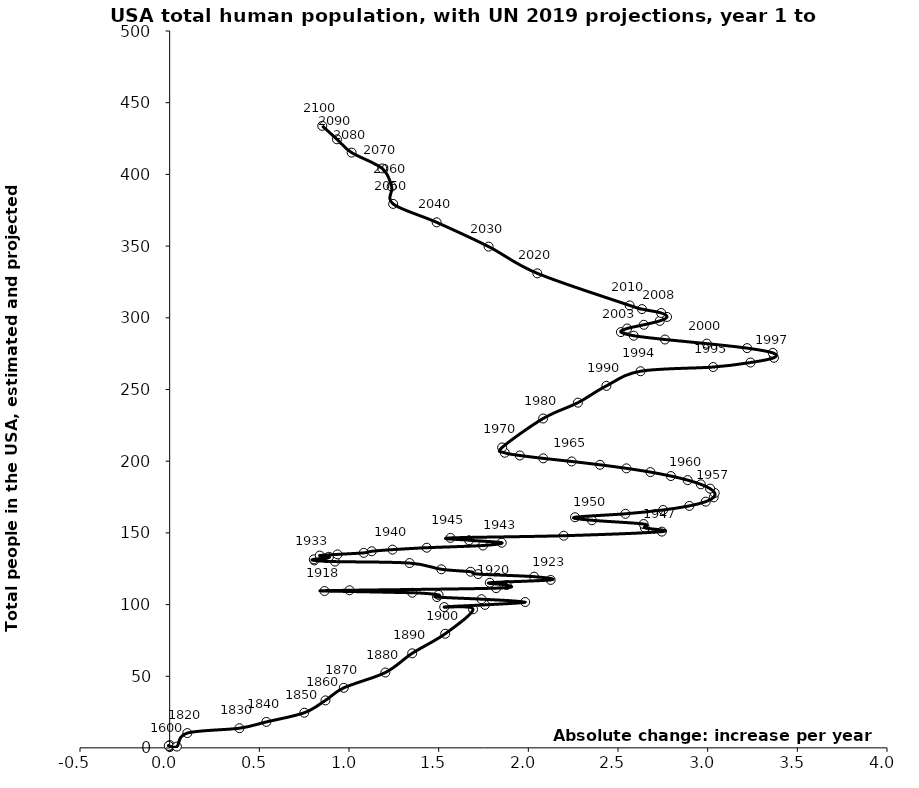
| Category | Series 0 |
|---|---|
| 0.00066 | 0.64 |
| 0.0009072715143428952 | 1.3 |
| 0.00033333333333333327 | 2 |
| -0.005 | 1.5 |
| 0.040494261848412885 | 1 |
| 0.09852621255219518 | 10.409 |
| 0.38917395290568474 | 13.808 |
| 0.5391515117391295 | 18.192 |
| 0.7506387753965683 | 24.591 |
| 0.8687885371431469 | 33.205 |
| 0.9708988578854225 | 41.967 |
| 1.2025425032091952 | 52.623 |
| 1.3522845372838561 | 66.018 |
| 1.536461801221178 | 79.669 |
| 1.6916889325819204 | 96.747 |
| 1.5309865428085487 | 98.277 |
| 1.7583401302283477 | 99.809 |
| 1.9825649985552047 | 101.794 |
| 1.739046362488594 | 103.774 |
| 1.4908346477825773 | 105.272 |
| 1.499699351879208 | 106.756 |
| 1.352649554511359 | 108.271 |
| 0.8635264696495071 | 109.461 |
| 1.0027544692850299 | 109.998 |
| 1.8203930589048483 | 111.467 |
| 1.8787958153062547 | 113.639 |
| 1.7849342425182755 | 115.224 |
| 2.12440026410151 | 117.209 |
| 2.0321030508599804 | 119.473 |
| 1.7202740479309924 | 121.273 |
| 1.6780363401763907 | 122.914 |
| 1.5150822207528059 | 124.629 |
| 1.3377881388199349 | 128.974 |
| 0.9219292260509206 | 129.981 |
| 0.8066880727945573 | 130.818 |
| 0.8040808068837748 | 131.594 |
| 0.8755198928390797 | 132.426 |
| 0.8880347692108188 | 133.345 |
| 0.8369323573595722 | 134.202 |
| 0.9360084619691094 | 135.019 |
| 1.082015352972661 | 136.074 |
| 1.1268603266380381 | 137.183 |
| 1.2426229330765608 | 138.328 |
| 1.4334747977454612 | 139.668 |
| 1.746868160220913 | 141.195 |
| 1.8516802498341889 | 143.162 |
| 1.6696930892619122 | 144.898 |
| 1.565923906012955 | 146.501 |
| 2.1974037096032646 | 148.03 |
| 2.744408097684399 | 150.896 |
| 2.6500250717142677 | 153.519 |
| 2.6427247271640653 | 156.196 |
| 2.354474408570894 | 158.804 |
| 2.260227999999998 | 160.905 |
| 2.5415775000000025 | 163.325 |
| 2.751381000000009 | 165.988 |
| 2.897825999999995 | 168.828 |
| 2.989163999999988 | 171.784 |
| 3.033657000000005 | 174.806 |
| 3.0392585000000025 | 177.851 |
| 3.0133584999999954 | 180.884 |
| 2.9618850000000094 | 183.878 |
| 2.88851600000001 | 186.808 |
| 2.794756499999991 | 189.655 |
| 2.6806529999999924 | 192.398 |
| 2.547051499999995 | 195.016 |
| 2.3996645 | 197.492 |
| 2.241689000000008 | 199.816 |
| 2.083194000000006 | 201.975 |
| 1.9525979999999947 | 203.982 |
| 1.8687406666666675 | 205.88 |
| 1.8538660000000107 | 209.588 |
| 2.0823979999999986 | 229.763 |
| 2.2766898000000024 | 240.824 |
| 2.435271777777776 | 252.53 |
| 2.625779799999992 | 262.742 |
| 3.0309290000000146 | 265.659 |
| 3.238851000000011 | 268.803 |
| 3.3695894999999894 | 272.137 |
| 3.3628630000000044 | 275.543 |
| 3.2200875000000053 | 278.862 |
| 2.9950570000000027 | 281.983 |
| 2.7620344999999986 | 284.852 |
| 2.5876164999999958 | 287.507 |
| 2.5162385000000143 | 290.028 |
| 2.550938500000001 | 292.539 |
| 2.6440159999999935 | 295.13 |
| 2.7328369999999893 | 297.827 |
| 2.773355500000008 | 300.595 |
| 2.740593500000017 | 303.374 |
| 2.633661999999987 | 306.076 |
| 2.5650289999999814 | 308.641 |
| 2.0500242500000043 | 331.003 |
| 1.7784751499999971 | 349.642 |
| 1.4888612999999906 | 366.572 |
| 1.2461371000000043 | 379.419 |
| 1.237764850000005 | 391.495 |
| 1.1851251500000046 | 404.174 |
| 1.0147758500000008 | 415.197 |
| 0.9328245999999922 | 424.47 |
| 0.8508733499999837 | 433.854 |